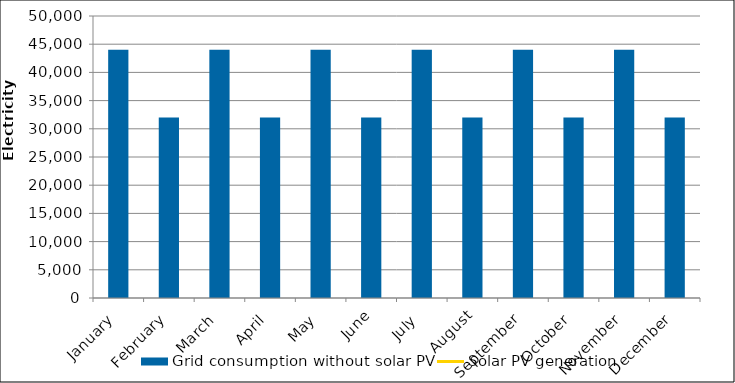
| Category | Grid consumption without solar PV |
|---|---|
| January | 44000 |
| February | 32000 |
| March | 44000 |
| April | 32000 |
| May | 44000 |
| June | 32000 |
| July | 44000 |
| August | 32000 |
| September | 44000 |
| October | 32000 |
| November | 44000 |
| December | 32000 |